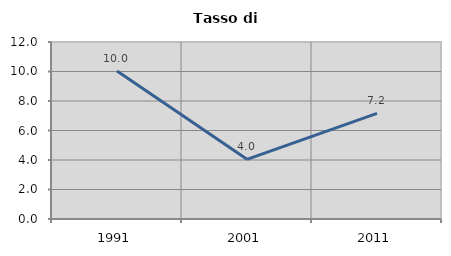
| Category | Tasso di disoccupazione   |
|---|---|
| 1991.0 | 10.034 |
| 2001.0 | 4.046 |
| 2011.0 | 7.158 |